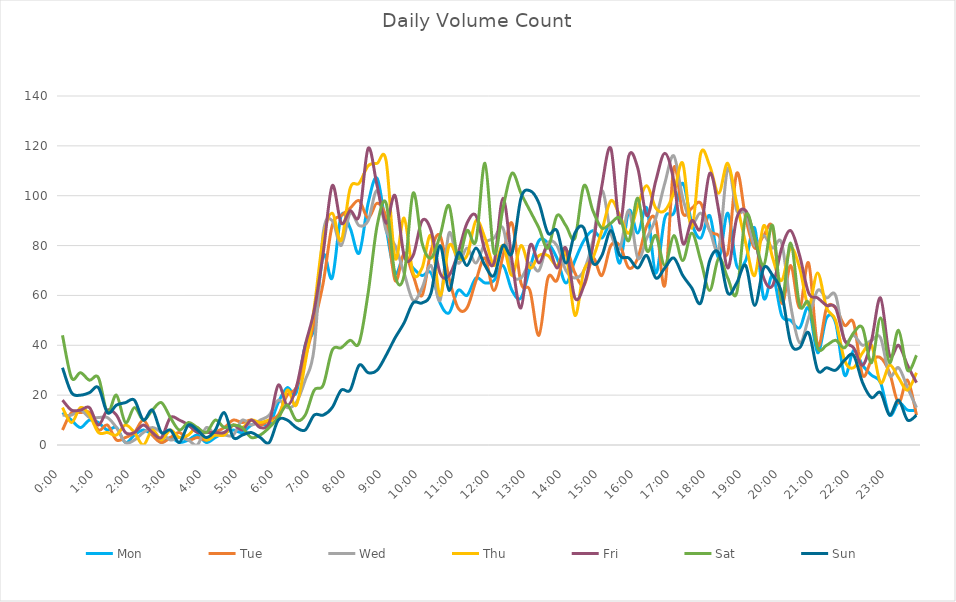
| Category | Mon | Tue | Wed | Thu | Fri | Sat | Sun |
|---|---|---|---|---|---|---|---|
| 0.0 | 13 | 6 | 12 | 15 | 18 | 44 | 31 |
| 0.010416666666666666 | 10 | 13 | 12 | 9 | 14 | 27 | 21 |
| 0.020833333333333332 | 7 | 13 | 14 | 15 | 14 | 29 | 20 |
| 0.03125 | 10 | 13 | 11 | 12 | 15 | 26 | 21 |
| 0.041666666666666664 | 9 | 6 | 11 | 5 | 8 | 27 | 23 |
| 0.05208333333333333 | 6 | 8 | 11 | 5 | 14 | 13 | 13 |
| 0.06249999999999999 | 7 | 2 | 7 | 4 | 12 | 20 | 16 |
| 0.07291666666666666 | 1 | 3 | 1 | 8 | 5 | 9 | 17 |
| 0.08333333333333333 | 4 | 5 | 2 | 5 | 5 | 15 | 18 |
| 0.09375 | 6 | 10 | 5 | 0 | 8 | 10 | 10 |
| 0.10416666666666667 | 4 | 4 | 7 | 6 | 5 | 14 | 14 |
| 0.11458333333333334 | 1 | 1 | 5 | 2 | 3 | 17 | 5 |
| 0.125 | 3 | 3 | 2 | 6 | 11 | 11 | 6 |
| 0.13541666666666666 | 1 | 5 | 3 | 3 | 10 | 6 | 1 |
| 0.14583333333333331 | 2 | 2 | 2 | 4 | 8 | 9 | 8 |
| 0.15624999999999997 | 4 | 3 | 0 | 7 | 5 | 7 | 6 |
| 0.16666666666666663 | 1 | 2 | 7 | 2 | 5 | 5 | 3 |
| 0.1770833333333333 | 3 | 5 | 4 | 4 | 5 | 10 | 6 |
| 0.18749999999999994 | 5 | 7 | 4 | 4 | 5 | 7 | 13 |
| 0.1979166666666666 | 6 | 10 | 4 | 8 | 8 | 8 | 3 |
| 0.20833333333333326 | 5 | 9 | 10 | 7 | 6 | 7 | 4 |
| 0.21874999999999992 | 8 | 10 | 8 | 10 | 10 | 3 | 5 |
| 0.22916666666666657 | 9 | 8 | 10 | 9 | 7 | 4 | 3 |
| 0.23958333333333323 | 8 | 10 | 12 | 10 | 9 | 7 | 1 |
| 0.2499999999999999 | 17 | 12 | 18 | 10 | 24 | 11 | 10 |
| 0.2604166666666666 | 23 | 20 | 15 | 22 | 16 | 16 | 10 |
| 0.27083333333333326 | 21 | 23 | 17 | 16 | 23 | 10 | 7 |
| 0.28124999999999994 | 40 | 35 | 26 | 33 | 40 | 12 | 6 |
| 0.29166666666666663 | 47 | 49 | 39 | 55 | 54 | 22 | 12 |
| 0.3020833333333333 | 76 | 65 | 85 | 83 | 77 | 24 | 12 |
| 0.3125 | 67 | 88 | 90 | 93 | 104 | 38 | 15 |
| 0.3229166666666667 | 92 | 92 | 80 | 82 | 89 | 39 | 22 |
| 0.33333333333333337 | 87 | 95 | 93 | 103 | 94 | 42 | 22 |
| 0.34375000000000006 | 77 | 98 | 88 | 105 | 92 | 41 | 32 |
| 0.35416666666666674 | 97 | 91 | 90 | 112 | 119 | 61 | 29 |
| 0.3645833333333334 | 107 | 97 | 102 | 113 | 104 | 88 | 30 |
| 0.3750000000000001 | 87 | 91 | 86 | 114 | 89 | 97 | 36 |
| 0.3854166666666668 | 69 | 66 | 80 | 75 | 100 | 68 | 43 |
| 0.3958333333333335 | 76 | 77 | 69 | 91 | 76 | 68 | 49 |
| 0.40625000000000017 | 71 | 68 | 58 | 69 | 76 | 101 | 57 |
| 0.41666666666666685 | 68 | 60 | 63 | 71 | 90 | 81 | 57 |
| 0.4270833333333333 | 69 | 78 | 72 | 84 | 86 | 75 | 61 |
| 0.4375000000000002 | 57 | 84 | 58 | 60 | 69 | 84 | 80 |
| 0.4479166666666669 | 53 | 67 | 85 | 80 | 68 | 96 | 62 |
| 0.4583333333333333 | 62 | 55 | 73 | 75 | 77 | 75 | 77 |
| 0.4687500000000003 | 60 | 55 | 79 | 76 | 89 | 86 | 72 |
| 0.47916666666666696 | 67 | 66 | 73 | 90 | 92 | 82 | 79 |
| 0.4895833333333333 | 65 | 75 | 81 | 83 | 78 | 113 | 72 |
| 0.5000000000000003 | 66 | 62 | 83 | 72 | 73 | 77 | 68 |
| 0.510416666666667 | 72 | 76 | 87 | 80 | 99 | 95 | 80 |
| 0.5208333333333334 | 62 | 89 | 69 | 68 | 74 | 109 | 77 |
| 0.5312500000000002 | 59 | 65 | 67 | 80 | 55 | 101 | 99 |
| 0.5416666666666669 | 71 | 62 | 73 | 71 | 80 | 94 | 102 |
| 0.5520833333333335 | 82 | 44 | 70 | 76 | 73 | 87 | 97 |
| 0.5625000000000001 | 81 | 67 | 81 | 76 | 80 | 79 | 85 |
| 0.5729166666666667 | 75 | 66 | 80 | 72 | 71 | 92 | 86 |
| 0.5833333333333334 | 65 | 78 | 70 | 77 | 79 | 88 | 73 |
| 0.59375 | 74 | 69 | 67 | 52 | 59 | 83 | 85 |
| 0.6041666666666666 | 82 | 64 | 70 | 70 | 64 | 104 | 87 |
| 0.6145833333333333 | 86 | 75 | 82 | 75 | 80 | 94 | 73 |
| 0.6249999999999999 | 83 | 68 | 102 | 86 | 104 | 87 | 76 |
| 0.6354166666666665 | 88 | 80 | 85 | 98 | 119 | 89 | 86 |
| 0.6458333333333331 | 73 | 80 | 79 | 92 | 89 | 91 | 76 |
| 0.6562499999999998 | 94 | 71 | 94 | 85 | 116 | 82 | 75 |
| 0.6666666666666666 | 85 | 75 | 75 | 96 | 111 | 99 | 71 |
| 0.677083333333333 | 95 | 88 | 83 | 104 | 92 | 78 | 76 |
| 0.6874999999999997 | 69 | 90 | 91 | 95 | 106 | 84 | 67 |
| 0.6979166666666666 | 91 | 64 | 105 | 94 | 117 | 72 | 71 |
| 0.7083333333333329 | 93 | 111 | 116 | 101 | 106 | 84 | 75 |
| 0.7187499999999996 | 105 | 93 | 99 | 113 | 81 | 74 | 68 |
| 0.7291666666666666 | 89 | 95 | 89 | 87 | 90 | 85 | 63 |
| 0.7395833333333328 | 83 | 97 | 93 | 117 | 87 | 74 | 57 |
| 0.75 | 92 | 86 | 86 | 112 | 109 | 62 | 74 |
| 0.7604166666666666 | 75 | 84 | 79 | 101 | 94 | 75 | 77 |
| 0.7708333333333327 | 93 | 77 | 111 | 113 | 71 | 67 | 61 |
| 0.78125 | 72 | 109 | 94 | 97 | 91 | 61 | 65 |
| 0.7916666666666666 | 74 | 91 | 93 | 81 | 94 | 92 | 72 |
| 0.8020833333333326 | 87 | 79 | 80 | 68 | 83 | 83 | 56 |
| 0.8125 | 59 | 84 | 84 | 88 | 67 | 72 | 71 |
| 0.8229166666666666 | 68 | 87 | 79 | 75 | 64 | 88 | 68 |
| 0.8333333333333334 | 52 | 57 | 81 | 66 | 79 | 58 | 61 |
| 0.84375 | 50 | 72 | 56 | 79 | 86 | 81 | 41 |
| 0.8541666666666666 | 47 | 55 | 41 | 71 | 76 | 56 | 39 |
| 0.8645833333333334 | 55 | 73 | 51 | 56 | 61 | 57 | 45 |
| 0.875 | 37 | 40 | 62 | 69 | 59 | 39 | 30 |
| 0.8854166666666666 | 51 | 55 | 59 | 55 | 56 | 40 | 31 |
| 0.8958333333333334 | 49 | 55 | 60 | 50 | 55 | 42 | 30 |
| 0.90625 | 28 | 48 | 42 | 34 | 42 | 39 | 34 |
| 0.9166666666666666 | 38 | 49 | 44 | 31 | 39 | 45 | 36 |
| 0.9270833333333334 | 32 | 28 | 40 | 37 | 32 | 47 | 25 |
| 0.9375 | 28 | 34 | 42 | 40 | 42 | 33 | 19 |
| 0.9479166666666666 | 25 | 35 | 43 | 25 | 59 | 51 | 21 |
| 0.9583333333333334 | 12 | 29 | 28 | 32 | 36 | 33 | 12 |
| 0.96875 | 17 | 17 | 31 | 27 | 40 | 46 | 18 |
| 0.9791666666666666 | 14 | 26 | 23 | 22 | 32 | 30 | 10 |
| 0.9895833333333334 | 14 | 12 | 15 | 29 | 25 | 36 | 12 |